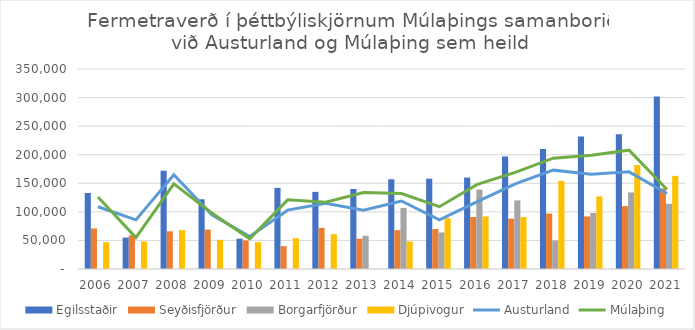
| Category | Egilsstaðir | Seyðisfjörður | Borgarfjörður | Djúpivogur |
|---|---|---|---|---|
| 2006.0 | 133000 | 71000 | 0 | 47000 |
| 2007.0 | 55000 | 59000 | 0 | 48000 |
| 2008.0 | 172000 | 66000 | 0 | 68000 |
| 2009.0 | 122000 | 69000 | 0 | 51000 |
| 2010.0 | 53000 | 50000 | 0 | 47000 |
| 2011.0 | 142000 | 40000 | 0 | 54000 |
| 2012.0 | 135000 | 72000 | 0 | 61000 |
| 2013.0 | 140000 | 53000 | 58000 | 0 |
| 2014.0 | 157000 | 68000 | 107000 | 48000 |
| 2015.0 | 158000 | 70000 | 64000 | 89000 |
| 2016.0 | 160000 | 91000 | 139000 | 92000 |
| 2017.0 | 197000 | 88000 | 120000 | 91000 |
| 2018.0 | 210000 | 97000 | 50000 | 154000 |
| 2019.0 | 232000 | 92000 | 98000 | 127000 |
| 2020.0 | 236000 | 110000 | 134000 | 182000 |
| 2021.0 | 302000 | 141000 | 114000 | 163000 |